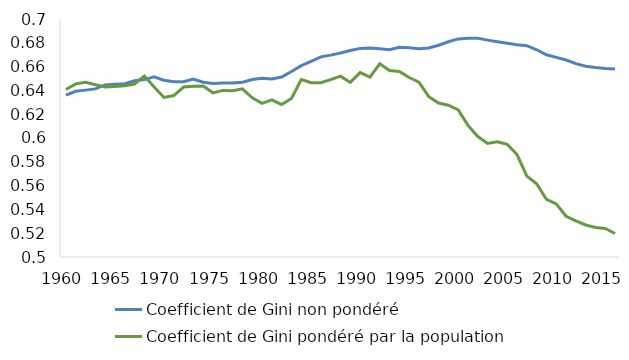
| Category | Coefficient de Gini non pondéré | Coefficient de Gini pondéré par la population |
|---|---|---|
| 1960.0 | 0.636 | 0.641 |
| 1961.0 | 0.639 | 0.646 |
| 1962.0 | 0.64 | 0.647 |
| 1963.0 | 0.641 | 0.645 |
| 1964.0 | 0.645 | 0.643 |
| 1965.0 | 0.645 | 0.643 |
| 1966.0 | 0.646 | 0.644 |
| 1967.0 | 0.648 | 0.645 |
| 1968.0 | 0.649 | 0.652 |
| 1969.0 | 0.651 | 0.643 |
| 1970.0 | 0.648 | 0.634 |
| 1971.0 | 0.647 | 0.636 |
| 1972.0 | 0.647 | 0.643 |
| 1973.0 | 0.65 | 0.643 |
| 1974.0 | 0.647 | 0.644 |
| 1975.0 | 0.646 | 0.638 |
| 1976.0 | 0.646 | 0.64 |
| 1977.0 | 0.646 | 0.64 |
| 1978.0 | 0.647 | 0.641 |
| 1979.0 | 0.649 | 0.634 |
| 1980.0 | 0.65 | 0.629 |
| 1981.0 | 0.65 | 0.632 |
| 1982.0 | 0.651 | 0.628 |
| 1983.0 | 0.656 | 0.633 |
| 1984.0 | 0.661 | 0.649 |
| 1985.0 | 0.664 | 0.646 |
| 1986.0 | 0.668 | 0.646 |
| 1987.0 | 0.67 | 0.649 |
| 1988.0 | 0.671 | 0.652 |
| 1989.0 | 0.673 | 0.647 |
| 1990.0 | 0.675 | 0.655 |
| 1991.0 | 0.676 | 0.651 |
| 1992.0 | 0.675 | 0.662 |
| 1993.0 | 0.674 | 0.657 |
| 1994.0 | 0.676 | 0.656 |
| 1995.0 | 0.676 | 0.651 |
| 1996.0 | 0.675 | 0.647 |
| 1997.0 | 0.676 | 0.635 |
| 1998.0 | 0.678 | 0.629 |
| 1999.0 | 0.681 | 0.628 |
| 2000.0 | 0.683 | 0.624 |
| 2001.0 | 0.684 | 0.611 |
| 2002.0 | 0.684 | 0.601 |
| 2003.0 | 0.682 | 0.595 |
| 2004.0 | 0.681 | 0.597 |
| 2005.0 | 0.68 | 0.595 |
| 2006.0 | 0.678 | 0.586 |
| 2007.0 | 0.678 | 0.568 |
| 2008.0 | 0.674 | 0.562 |
| 2009.0 | 0.67 | 0.549 |
| 2010.0 | 0.668 | 0.545 |
| 2011.0 | 0.666 | 0.534 |
| 2012.0 | 0.663 | 0.53 |
| 2013.0 | 0.66 | 0.527 |
| 2014.0 | 0.659 | 0.525 |
| 2015.0 | 0.658 | 0.524 |
| 2016.0 | 0.658 | 0.52 |